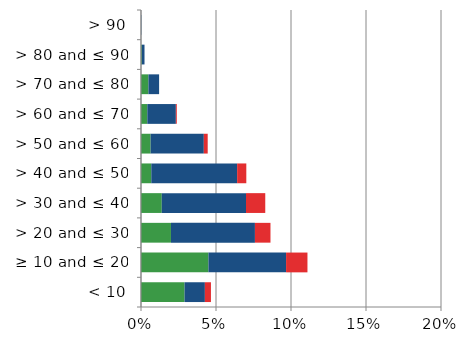
| Category | England | Scotland | Wales |
|---|---|---|---|
|  < 10 | 0.029 | 0.014 | 0.004 |
|  ≥ 10 and ≤ 20 | 0.045 | 0.052 | 0.014 |
|  > 20 and ≤ 30 | 0.02 | 0.056 | 0.01 |
|  > 30 and ≤ 40 | 0.014 | 0.056 | 0.013 |
|  > 40 and ≤ 50 | 0.007 | 0.057 | 0.006 |
|  > 50 and ≤ 60 | 0.006 | 0.035 | 0.003 |
|  > 60 and ≤ 70 | 0.004 | 0.019 | 0.001 |
|  > 70 and ≤ 80 | 0.005 | 0.007 | 0 |
|  > 80 and ≤ 90 | 0.001 | 0.002 | 0 |
|  > 90 | 0 | 0 | 0 |